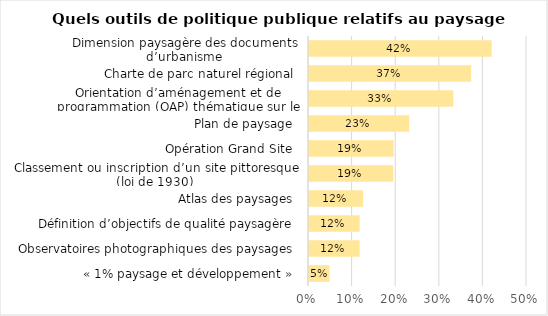
| Category | Series 0 |
|---|---|
| « 1% paysage et développement »  | 0.047 |
| Observatoires photographiques des paysages  | 0.116 |
| Définition d’objectifs de qualité paysagère  | 0.116 |
| Atlas des paysages  | 0.124 |
| Classement ou inscription d’un site pittoresque (loi de 1930)  | 0.193 |
| Opération Grand Site  | 0.194 |
| Plan de paysage  | 0.23 |
| Orientation d’aménagement et de programmation (OAP) thématique sur le paysage  | 0.331 |
| Charte de parc naturel régional  | 0.372 |
| Dimension paysagère des documents d’urbanisme  | 0.419 |